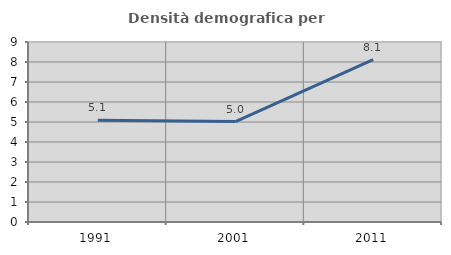
| Category | Densità demografica |
|---|---|
| 1991.0 | 5.09 |
| 2001.0 | 5.022 |
| 2011.0 | 8.116 |